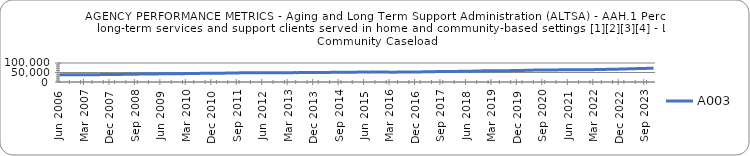
| Category | A003 |
|---|---|
| 0.76721 | 37578 |
| 0.76724 | 37552 |
| 0.76937 | 37785 |
| 0.77188 | 37863 |
| 0.77291 | 38105 |
| 0.77287 | 38117 |
| 0.77281 | 38153 |
| 0.77321 | 37949 |
| 0.77487 | 38055 |
| 0.77588 | 38291 |
| 0.77547 | 38350 |
| 0.77665 | 38462 |
| 0.77799 | 38451 |
| 0.78001 | 38519 |
| 0.78165 | 38742 |
| 0.78378 | 38905 |
| 0.78567 | 39201 |
| 0.78719 | 39276 |
| 0.7887 | 39363 |
| 0.79022 | 39558 |
| 0.79129 | 39671 |
| 0.79193 | 39953 |
| 0.79455 | 40130 |
| 0.79439 | 40309 |
| 0.79457 | 40326 |
| 0.79632 | 40579 |
| 0.79721 | 40848 |
| 0.79865 | 41059 |
| 0.79917 | 41489 |
| 0.79965 | 41566 |
| 0.79991 | 41694 |
| 0.80036 | 41691 |
| 0.80119 | 41874 |
| 0.80135 | 42298 |
| 0.80196 | 42513 |
| 0.80282 | 42748 |
| 0.80375 | 42913 |
| 0.80441 | 43165 |
| 0.80454 | 43426 |
| 0.80574 | 43636 |
| 0.80717 | 43910 |
| 0.80907 | 43990 |
| 0.80996 | 44094 |
| 0.81048 | 43999 |
| 0.81132 | 43990 |
| 0.81235 | 44361 |
| 0.81422 | 44490 |
| 0.81521 | 44810 |
| 0.81511 | 45036 |
| 0.816 | 45288 |
| 0.81562 | 45476 |
| 0.8177 | 45662 |
| 0.81902 | 45924 |
| 0.81999 | 45897 |
| 0.8202 | 45899 |
| 0.82092 | 45930 |
| 0.82336 | 45753 |
| 0.82379 | 46333 |
| 0.82545 | 46545 |
| 0.82578 | 46809 |
| 0.82632 | 46882 |
| 0.82543 | 47025 |
| 0.82484 | 47581 |
| 0.82636 | 47704 |
| 0.82733 | 48237 |
| 0.82838 | 48215 |
| 0.82888 | 48508 |
| 0.82809 | 48041 |
| 0.82917 | 48018 |
| 0.82866 | 48385 |
| 0.82858 | 48517 |
| 0.82802 | 48703 |
| 0.82938 | 48796 |
| 0.83046 | 48742 |
| 0.83086 | 49002 |
| 0.83171 | 48805 |
| 0.83162 | 49085 |
| 0.83156 | 48930 |
| 0.8309 | 48966 |
| 0.83222 | 49048 |
| 0.83276 | 48888 |
| 0.83338 | 49036 |
| 0.83336 | 49149 |
| 0.83239 | 49347 |
| 0.83251 | 49319 |
| 0.8337 | 49483 |
| 0.83426 | 49651 |
| 0.83557 | 49690 |
| 0.83627 | 49927 |
| 0.83614 | 49934 |
| 0.83597 | 49983 |
| 0.83796 | 50117 |
| 0.83821 | 50003 |
| 0.83855 | 50331 |
| 0.84014 | 50408 |
| 0.83995 | 50588 |
| 0.84007 | 50659 |
| 0.8402 | 50993 |
| 0.841 | 51002 |
| 0.8424 | 51213 |
| 0.8431 | 51571 |
| 0.8435 | 51477 |
| 0.8439 | 51678 |
| 0.84383 | 51183 |
| 0.84463 | 51239 |
| 0.84443 | 51830 |
| 0.84487 | 52166 |
| 0.84543 | 52326 |
| 0.8466 | 52403 |
| 0.84682 | 51905 |
| 0.84816 | 52094 |
| 0.84589 | 52077 |
| 0.84646 | 52407 |
| 0.84772 | 52425 |
| 0.8486 | 52511 |
| 0.84786 | 52291 |
| 0.84849 | 52591 |
| 0.84851 | 51414 |
| 0.8492 | 51634 |
| 0.84852 | 51876 |
| 0.84989 | 52198 |
| 0.85076 | 52194 |
| 0.85196 | 52601 |
| 0.8534 | 52894 |
| 0.85355 | 53115 |
| 0.85326 | 53226 |
| 0.85294 | 53256 |
| 0.85119 | 53206 |
| 0.85152 | 53182 |
| 0.85143 | 53754 |
| 0.85182 | 53845 |
| 0.8521 | 54038 |
| 0.85264 | 54229 |
| 0.85441 | 54648.406 |
| 0.85526 | 54991.564 |
| 0.85728 | 55017.135 |
| 0.8577 | 55287.048 |
| 0.85845 | 55405.01 |
| 0.85828 | 55421.33 |
| 0.85799 | 55538.203 |
| 0.85772 | 55555.31 |
| 0.85887 | 56036.683 |
| 0.86116 | 56151.821 |
| 0.86123 | 56469.98 |
| 0.86193 | 56550.383 |
| 0.86372 | 56923.273 |
| 0.86147 | 57174.661 |
| 0.86303 | 57784.508 |
| 0.86431 | 58491.494 |
| 0.86533 | 58393 |
| 0.86473 | 58811 |
| 0.86411 | 59484 |
| 0.86504 | 58599 |
| 0.86518 | 59161 |
| 0.86641 | 59493 |
| 0.86717 | 59861 |
| 0.86792 | 59766 |
| 0.8694 | 59074.854 |
| 0.86921 | 59445 |
| 0.87375 | 59676 |
| 0.87927 | 60096 |
| 0.88196 | 60205.922 |
| 0.8826 | 60307.536 |
| 0.88378 | 60993 |
| 0.88511 | 60682 |
| 0.8857 | 61838 |
| 0.88923 | 62204 |
| 0.89424 | 62381 |
| 0.89466 | 62736 |
| 0.89512 | 62718 |
| 0.89475 | 62809 |
| 0.89525 | 62979 |
| 0.89485 | 63283 |
| 0.89346 | 63240 |
| 0.89386 | 63519 |
| 0.89048 | 63245 |
| 0.89013 | 63507 |
| 0.89185 | 64304 |
| 0.8934 | 64386 |
| 0.89298 | 64424 |
| 0.89372 | 64861 |
| 0.89661 | 64329 |
| 0.89824 | 64331 |
| 0.89708 | 64270 |
| 0.89662 | 64342 |
| 0.89759 | 64062 |
| 0.89814 | 64107 |
| 0.89823 | 63959 |
| 0.89819 | 64344 |
| 0.89789 | 65133 |
| 0.89829 | 65535 |
| 0.89874 | 65882 |
| 0.90061 | 66176 |
| 0.90125 | 66380 |
| 0.90115 | 66852 |
| 0.90196 | 66989 |
| 0.90133 | 67268 |
| 0.90135 | 67474 |
| 0.90118 | 67917 |
| 0.90219 | 68234 |
| 0.90296 | 68386 |
| 0.90356 | 69547 |
| 0.90607 | 69534 |
| 0.90755 | 70252 |
| 0.91023 | 70386 |
| nan | 70598 |
| nan | 71226 |
| nan | 71311 |
| nan | 72154 |
| nan | 72190 |
| nan | 72264 |